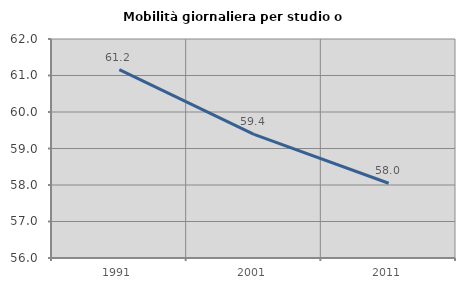
| Category | Mobilità giornaliera per studio o lavoro |
|---|---|
| 1991.0 | 61.161 |
| 2001.0 | 59.386 |
| 2011.0 | 58.048 |